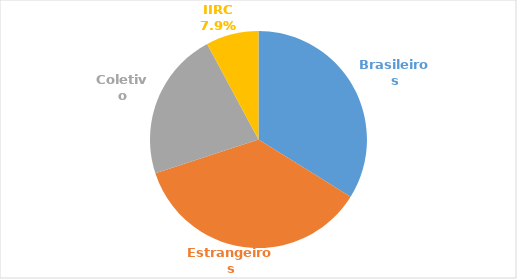
| Category | # |
|---|---|
| Brasileiros | 345 |
| Estrangeiros | 368 |
| Coletivo | 226 |
| IIRC | 80 |